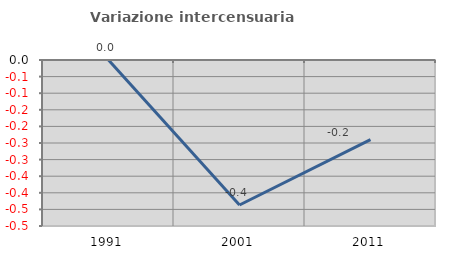
| Category | Variazione intercensuaria annua |
|---|---|
| 1991.0 | 0 |
| 2001.0 | -0.437 |
| 2011.0 | -0.24 |